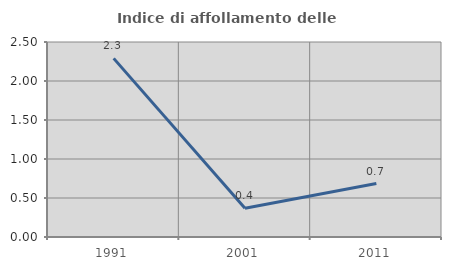
| Category | Indice di affollamento delle abitazioni  |
|---|---|
| 1991.0 | 2.29 |
| 2001.0 | 0.369 |
| 2011.0 | 0.685 |